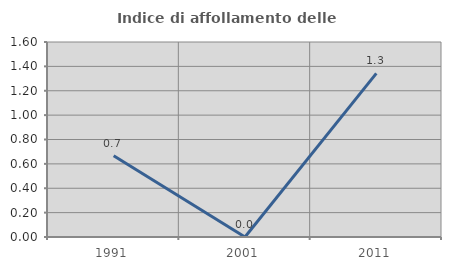
| Category | Indice di affollamento delle abitazioni  |
|---|---|
| 1991.0 | 0.667 |
| 2001.0 | 0 |
| 2011.0 | 1.342 |